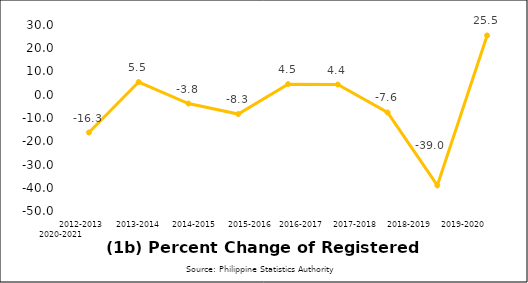
| Category | Series 0 |
|---|---|
| 2012-2013 | -16.257 |
| 2013-2014 | 5.457 |
| 2014-2015 | -3.773 |
| 2015-2016 | -8.302 |
| 2016-2017 | 4.547 |
| 2017-2018 | 4.405 |
| 2018-2019 | -7.622 |
| 2019-2020 | -39.009 |
| 2020-2021 | 25.501 |